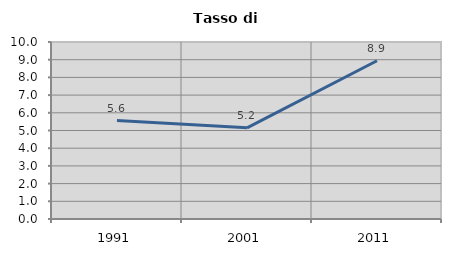
| Category | Tasso di disoccupazione   |
|---|---|
| 1991.0 | 5.564 |
| 2001.0 | 5.15 |
| 2011.0 | 8.942 |